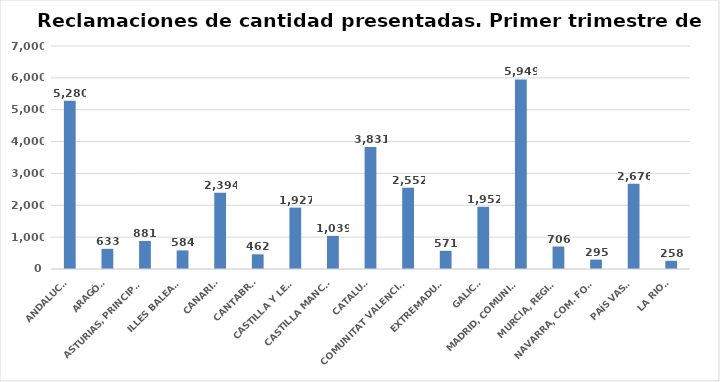
| Category | Series 0 |
|---|---|
| ANDALUCÍA | 5280 |
| ARAGÓN | 633 |
| ASTURIAS, PRINCIPADO | 881 |
| ILLES BALEARS | 584 |
| CANARIAS | 2394 |
| CANTABRIA | 462 |
| CASTILLA Y LEÓN | 1927 |
| CASTILLA MANCHA | 1039 |
| CATALUÑA | 3831 |
| COMUNITAT VALENCIANA | 2552 |
| EXTREMADURA | 571 |
| GALICIA | 1952 |
| MADRID, COMUNIDAD | 5949 |
| MURCIA, REGIÓN | 706 |
| NAVARRA, COM. FORAL | 295 |
| PAÍS VASCO | 2676 |
| LA RIOJA | 258 |